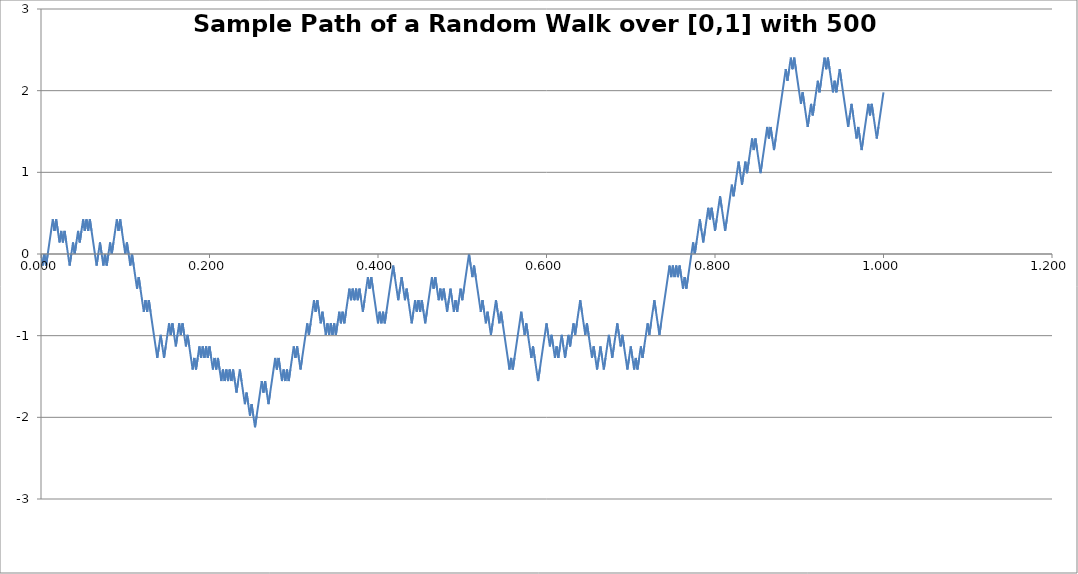
| Category | W_i |
|---|---|
| 0.0 | 0 |
| 0.002 | -0.141 |
| 0.004 | 0 |
| 0.006 | -0.141 |
| 0.008 | 0 |
| 0.01 | 0.141 |
| 0.012 | 0.283 |
| 0.014 | 0.424 |
| 0.016 | 0.283 |
| 0.018000000000000002 | 0.424 |
| 0.020000000000000004 | 0.283 |
| 0.022000000000000006 | 0.141 |
| 0.024000000000000007 | 0.283 |
| 0.02600000000000001 | 0.141 |
| 0.02800000000000001 | 0.283 |
| 0.030000000000000013 | 0.141 |
| 0.032000000000000015 | 0 |
| 0.034000000000000016 | -0.141 |
| 0.03600000000000002 | 0 |
| 0.03800000000000002 | 0.141 |
| 0.04000000000000002 | 0 |
| 0.04200000000000002 | 0.141 |
| 0.044000000000000025 | 0.283 |
| 0.04600000000000003 | 0.141 |
| 0.04800000000000003 | 0.283 |
| 0.05000000000000003 | 0.424 |
| 0.05200000000000003 | 0.283 |
| 0.054000000000000034 | 0.424 |
| 0.056000000000000036 | 0.283 |
| 0.05800000000000004 | 0.424 |
| 0.06000000000000004 | 0.283 |
| 0.06200000000000004 | 0.141 |
| 0.06400000000000004 | 0 |
| 0.06600000000000004 | -0.141 |
| 0.06800000000000005 | 0 |
| 0.07000000000000005 | 0.141 |
| 0.07200000000000005 | 0 |
| 0.07400000000000005 | -0.141 |
| 0.07600000000000005 | 0 |
| 0.07800000000000006 | -0.141 |
| 0.08000000000000006 | 0 |
| 0.08200000000000006 | 0.141 |
| 0.08400000000000006 | 0 |
| 0.08600000000000006 | 0.141 |
| 0.08800000000000006 | 0.283 |
| 0.09000000000000007 | 0.424 |
| 0.09200000000000007 | 0.283 |
| 0.09400000000000007 | 0.424 |
| 0.09600000000000007 | 0.283 |
| 0.09800000000000007 | 0.141 |
| 0.10000000000000007 | 0 |
| 0.10200000000000008 | 0.141 |
| 0.10400000000000008 | 0 |
| 0.10600000000000008 | -0.141 |
| 0.10800000000000008 | 0 |
| 0.11000000000000008 | -0.141 |
| 0.11200000000000009 | -0.283 |
| 0.11400000000000009 | -0.424 |
| 0.11600000000000009 | -0.283 |
| 0.11800000000000009 | -0.424 |
| 0.12000000000000009 | -0.566 |
| 0.1220000000000001 | -0.707 |
| 0.1240000000000001 | -0.566 |
| 0.12600000000000008 | -0.707 |
| 0.12800000000000009 | -0.566 |
| 0.1300000000000001 | -0.707 |
| 0.1320000000000001 | -0.849 |
| 0.1340000000000001 | -0.99 |
| 0.1360000000000001 | -1.131 |
| 0.1380000000000001 | -1.273 |
| 0.1400000000000001 | -1.131 |
| 0.1420000000000001 | -0.99 |
| 0.1440000000000001 | -1.131 |
| 0.1460000000000001 | -1.273 |
| 0.1480000000000001 | -1.131 |
| 0.1500000000000001 | -0.99 |
| 0.1520000000000001 | -0.849 |
| 0.1540000000000001 | -0.99 |
| 0.1560000000000001 | -0.849 |
| 0.1580000000000001 | -0.99 |
| 0.16000000000000011 | -1.131 |
| 0.16200000000000012 | -0.99 |
| 0.16400000000000012 | -0.849 |
| 0.16600000000000012 | -0.99 |
| 0.16800000000000012 | -0.849 |
| 0.17000000000000012 | -0.99 |
| 0.17200000000000013 | -1.131 |
| 0.17400000000000013 | -0.99 |
| 0.17600000000000013 | -1.131 |
| 0.17800000000000013 | -1.273 |
| 0.18000000000000013 | -1.414 |
| 0.18200000000000013 | -1.273 |
| 0.18400000000000014 | -1.414 |
| 0.18600000000000014 | -1.273 |
| 0.18800000000000014 | -1.131 |
| 0.19000000000000014 | -1.273 |
| 0.19200000000000014 | -1.131 |
| 0.19400000000000014 | -1.273 |
| 0.19600000000000015 | -1.131 |
| 0.19800000000000015 | -1.273 |
| 0.20000000000000015 | -1.131 |
| 0.20200000000000015 | -1.273 |
| 0.20400000000000015 | -1.414 |
| 0.20600000000000016 | -1.273 |
| 0.20800000000000016 | -1.414 |
| 0.21000000000000016 | -1.273 |
| 0.21200000000000016 | -1.414 |
| 0.21400000000000016 | -1.556 |
| 0.21600000000000016 | -1.414 |
| 0.21800000000000017 | -1.556 |
| 0.22000000000000017 | -1.414 |
| 0.22200000000000017 | -1.556 |
| 0.22400000000000017 | -1.414 |
| 0.22600000000000017 | -1.556 |
| 0.22800000000000017 | -1.414 |
| 0.23000000000000018 | -1.556 |
| 0.23200000000000018 | -1.697 |
| 0.23400000000000018 | -1.556 |
| 0.23600000000000018 | -1.414 |
| 0.23800000000000018 | -1.556 |
| 0.24000000000000019 | -1.697 |
| 0.2420000000000002 | -1.838 |
| 0.2440000000000002 | -1.697 |
| 0.2460000000000002 | -1.838 |
| 0.2480000000000002 | -1.98 |
| 0.25000000000000017 | -1.838 |
| 0.25200000000000017 | -1.98 |
| 0.25400000000000017 | -2.121 |
| 0.25600000000000017 | -1.98 |
| 0.2580000000000002 | -1.838 |
| 0.2600000000000002 | -1.697 |
| 0.2620000000000002 | -1.556 |
| 0.2640000000000002 | -1.697 |
| 0.2660000000000002 | -1.556 |
| 0.2680000000000002 | -1.697 |
| 0.2700000000000002 | -1.838 |
| 0.2720000000000002 | -1.697 |
| 0.2740000000000002 | -1.556 |
| 0.2760000000000002 | -1.414 |
| 0.2780000000000002 | -1.273 |
| 0.2800000000000002 | -1.414 |
| 0.2820000000000002 | -1.273 |
| 0.2840000000000002 | -1.414 |
| 0.2860000000000002 | -1.556 |
| 0.2880000000000002 | -1.414 |
| 0.2900000000000002 | -1.556 |
| 0.2920000000000002 | -1.414 |
| 0.2940000000000002 | -1.556 |
| 0.2960000000000002 | -1.414 |
| 0.2980000000000002 | -1.273 |
| 0.3000000000000002 | -1.131 |
| 0.3020000000000002 | -1.273 |
| 0.3040000000000002 | -1.131 |
| 0.3060000000000002 | -1.273 |
| 0.3080000000000002 | -1.414 |
| 0.3100000000000002 | -1.273 |
| 0.3120000000000002 | -1.131 |
| 0.3140000000000002 | -0.99 |
| 0.3160000000000002 | -0.849 |
| 0.3180000000000002 | -0.99 |
| 0.32000000000000023 | -0.849 |
| 0.32200000000000023 | -0.707 |
| 0.32400000000000023 | -0.566 |
| 0.32600000000000023 | -0.707 |
| 0.32800000000000024 | -0.566 |
| 0.33000000000000024 | -0.707 |
| 0.33200000000000024 | -0.849 |
| 0.33400000000000024 | -0.707 |
| 0.33600000000000024 | -0.849 |
| 0.33800000000000024 | -0.99 |
| 0.34000000000000025 | -0.849 |
| 0.34200000000000025 | -0.99 |
| 0.34400000000000025 | -0.849 |
| 0.34600000000000025 | -0.99 |
| 0.34800000000000025 | -0.849 |
| 0.35000000000000026 | -0.99 |
| 0.35200000000000026 | -0.849 |
| 0.35400000000000026 | -0.707 |
| 0.35600000000000026 | -0.849 |
| 0.35800000000000026 | -0.707 |
| 0.36000000000000026 | -0.849 |
| 0.36200000000000027 | -0.707 |
| 0.36400000000000027 | -0.566 |
| 0.36600000000000027 | -0.424 |
| 0.36800000000000027 | -0.566 |
| 0.3700000000000003 | -0.424 |
| 0.3720000000000003 | -0.566 |
| 0.3740000000000003 | -0.424 |
| 0.3760000000000003 | -0.566 |
| 0.3780000000000003 | -0.424 |
| 0.3800000000000003 | -0.566 |
| 0.3820000000000003 | -0.707 |
| 0.3840000000000003 | -0.566 |
| 0.3860000000000003 | -0.424 |
| 0.3880000000000003 | -0.283 |
| 0.3900000000000003 | -0.424 |
| 0.3920000000000003 | -0.283 |
| 0.3940000000000003 | -0.424 |
| 0.3960000000000003 | -0.566 |
| 0.3980000000000003 | -0.707 |
| 0.4000000000000003 | -0.849 |
| 0.4020000000000003 | -0.707 |
| 0.4040000000000003 | -0.849 |
| 0.4060000000000003 | -0.707 |
| 0.4080000000000003 | -0.849 |
| 0.4100000000000003 | -0.707 |
| 0.4120000000000003 | -0.566 |
| 0.4140000000000003 | -0.424 |
| 0.4160000000000003 | -0.283 |
| 0.4180000000000003 | -0.141 |
| 0.4200000000000003 | -0.283 |
| 0.4220000000000003 | -0.424 |
| 0.4240000000000003 | -0.566 |
| 0.4260000000000003 | -0.424 |
| 0.4280000000000003 | -0.283 |
| 0.4300000000000003 | -0.424 |
| 0.43200000000000033 | -0.566 |
| 0.43400000000000033 | -0.424 |
| 0.43600000000000033 | -0.566 |
| 0.43800000000000033 | -0.707 |
| 0.44000000000000034 | -0.849 |
| 0.44200000000000034 | -0.707 |
| 0.44400000000000034 | -0.566 |
| 0.44600000000000034 | -0.707 |
| 0.44800000000000034 | -0.566 |
| 0.45000000000000034 | -0.707 |
| 0.45200000000000035 | -0.566 |
| 0.45400000000000035 | -0.707 |
| 0.45600000000000035 | -0.849 |
| 0.45800000000000035 | -0.707 |
| 0.46000000000000035 | -0.566 |
| 0.46200000000000035 | -0.424 |
| 0.46400000000000036 | -0.283 |
| 0.46600000000000036 | -0.424 |
| 0.46800000000000036 | -0.283 |
| 0.47000000000000036 | -0.424 |
| 0.47200000000000036 | -0.566 |
| 0.47400000000000037 | -0.424 |
| 0.47600000000000037 | -0.566 |
| 0.47800000000000037 | -0.424 |
| 0.48000000000000037 | -0.566 |
| 0.4820000000000004 | -0.707 |
| 0.4840000000000004 | -0.566 |
| 0.4860000000000004 | -0.424 |
| 0.4880000000000004 | -0.566 |
| 0.4900000000000004 | -0.707 |
| 0.4920000000000004 | -0.566 |
| 0.4940000000000004 | -0.707 |
| 0.4960000000000004 | -0.566 |
| 0.4980000000000004 | -0.424 |
| 0.5000000000000003 | -0.566 |
| 0.5020000000000003 | -0.424 |
| 0.5040000000000003 | -0.283 |
| 0.5060000000000003 | -0.141 |
| 0.5080000000000003 | 0 |
| 0.5100000000000003 | -0.141 |
| 0.5120000000000003 | -0.283 |
| 0.5140000000000003 | -0.141 |
| 0.5160000000000003 | -0.283 |
| 0.5180000000000003 | -0.424 |
| 0.5200000000000004 | -0.566 |
| 0.5220000000000004 | -0.707 |
| 0.5240000000000004 | -0.566 |
| 0.5260000000000004 | -0.707 |
| 0.5280000000000004 | -0.849 |
| 0.5300000000000004 | -0.707 |
| 0.5320000000000004 | -0.849 |
| 0.5340000000000004 | -0.99 |
| 0.5360000000000004 | -0.849 |
| 0.5380000000000004 | -0.707 |
| 0.5400000000000004 | -0.566 |
| 0.5420000000000004 | -0.707 |
| 0.5440000000000004 | -0.849 |
| 0.5460000000000004 | -0.707 |
| 0.5480000000000004 | -0.849 |
| 0.5500000000000004 | -0.99 |
| 0.5520000000000004 | -1.131 |
| 0.5540000000000004 | -1.273 |
| 0.5560000000000004 | -1.414 |
| 0.5580000000000004 | -1.273 |
| 0.5600000000000004 | -1.414 |
| 0.5620000000000004 | -1.273 |
| 0.5640000000000004 | -1.131 |
| 0.5660000000000004 | -0.99 |
| 0.5680000000000004 | -0.849 |
| 0.5700000000000004 | -0.707 |
| 0.5720000000000004 | -0.849 |
| 0.5740000000000004 | -0.99 |
| 0.5760000000000004 | -0.849 |
| 0.5780000000000004 | -0.99 |
| 0.5800000000000004 | -1.131 |
| 0.5820000000000004 | -1.273 |
| 0.5840000000000004 | -1.131 |
| 0.5860000000000004 | -1.273 |
| 0.5880000000000004 | -1.414 |
| 0.5900000000000004 | -1.556 |
| 0.5920000000000004 | -1.414 |
| 0.5940000000000004 | -1.273 |
| 0.5960000000000004 | -1.131 |
| 0.5980000000000004 | -0.99 |
| 0.6000000000000004 | -0.849 |
| 0.6020000000000004 | -0.99 |
| 0.6040000000000004 | -1.131 |
| 0.6060000000000004 | -0.99 |
| 0.6080000000000004 | -1.131 |
| 0.6100000000000004 | -1.273 |
| 0.6120000000000004 | -1.131 |
| 0.6140000000000004 | -1.273 |
| 0.6160000000000004 | -1.131 |
| 0.6180000000000004 | -0.99 |
| 0.6200000000000004 | -1.131 |
| 0.6220000000000004 | -1.273 |
| 0.6240000000000004 | -1.131 |
| 0.6260000000000004 | -0.99 |
| 0.6280000000000004 | -1.131 |
| 0.6300000000000004 | -0.99 |
| 0.6320000000000005 | -0.849 |
| 0.6340000000000005 | -0.99 |
| 0.6360000000000005 | -0.849 |
| 0.6380000000000005 | -0.707 |
| 0.6400000000000005 | -0.566 |
| 0.6420000000000005 | -0.707 |
| 0.6440000000000005 | -0.849 |
| 0.6460000000000005 | -0.99 |
| 0.6480000000000005 | -0.849 |
| 0.6500000000000005 | -0.99 |
| 0.6520000000000005 | -1.131 |
| 0.6540000000000005 | -1.273 |
| 0.6560000000000005 | -1.131 |
| 0.6580000000000005 | -1.273 |
| 0.6600000000000005 | -1.414 |
| 0.6620000000000005 | -1.273 |
| 0.6640000000000005 | -1.131 |
| 0.6660000000000005 | -1.273 |
| 0.6680000000000005 | -1.414 |
| 0.6700000000000005 | -1.273 |
| 0.6720000000000005 | -1.131 |
| 0.6740000000000005 | -0.99 |
| 0.6760000000000005 | -1.131 |
| 0.6780000000000005 | -1.273 |
| 0.6800000000000005 | -1.131 |
| 0.6820000000000005 | -0.99 |
| 0.6840000000000005 | -0.849 |
| 0.6860000000000005 | -0.99 |
| 0.6880000000000005 | -1.131 |
| 0.6900000000000005 | -0.99 |
| 0.6920000000000005 | -1.131 |
| 0.6940000000000005 | -1.273 |
| 0.6960000000000005 | -1.414 |
| 0.6980000000000005 | -1.273 |
| 0.7000000000000005 | -1.131 |
| 0.7020000000000005 | -1.273 |
| 0.7040000000000005 | -1.414 |
| 0.7060000000000005 | -1.273 |
| 0.7080000000000005 | -1.414 |
| 0.7100000000000005 | -1.273 |
| 0.7120000000000005 | -1.131 |
| 0.7140000000000005 | -1.273 |
| 0.7160000000000005 | -1.131 |
| 0.7180000000000005 | -0.99 |
| 0.7200000000000005 | -0.849 |
| 0.7220000000000005 | -0.99 |
| 0.7240000000000005 | -0.849 |
| 0.7260000000000005 | -0.707 |
| 0.7280000000000005 | -0.566 |
| 0.7300000000000005 | -0.707 |
| 0.7320000000000005 | -0.849 |
| 0.7340000000000005 | -0.99 |
| 0.7360000000000005 | -0.849 |
| 0.7380000000000005 | -0.707 |
| 0.7400000000000005 | -0.566 |
| 0.7420000000000005 | -0.424 |
| 0.7440000000000005 | -0.283 |
| 0.7460000000000006 | -0.141 |
| 0.7480000000000006 | -0.283 |
| 0.7500000000000006 | -0.141 |
| 0.7520000000000006 | -0.283 |
| 0.7540000000000006 | -0.141 |
| 0.7560000000000006 | -0.283 |
| 0.7580000000000006 | -0.141 |
| 0.7600000000000006 | -0.283 |
| 0.7620000000000006 | -0.424 |
| 0.7640000000000006 | -0.283 |
| 0.7660000000000006 | -0.424 |
| 0.7680000000000006 | -0.283 |
| 0.7700000000000006 | -0.141 |
| 0.7720000000000006 | 0 |
| 0.7740000000000006 | 0.141 |
| 0.7760000000000006 | 0 |
| 0.7780000000000006 | 0.141 |
| 0.7800000000000006 | 0.283 |
| 0.7820000000000006 | 0.424 |
| 0.7840000000000006 | 0.283 |
| 0.7860000000000006 | 0.141 |
| 0.7880000000000006 | 0.283 |
| 0.7900000000000006 | 0.424 |
| 0.7920000000000006 | 0.566 |
| 0.7940000000000006 | 0.424 |
| 0.7960000000000006 | 0.566 |
| 0.7980000000000006 | 0.424 |
| 0.8000000000000006 | 0.283 |
| 0.8020000000000006 | 0.424 |
| 0.8040000000000006 | 0.566 |
| 0.8060000000000006 | 0.707 |
| 0.8080000000000006 | 0.566 |
| 0.8100000000000006 | 0.424 |
| 0.8120000000000006 | 0.283 |
| 0.8140000000000006 | 0.424 |
| 0.8160000000000006 | 0.566 |
| 0.8180000000000006 | 0.707 |
| 0.8200000000000006 | 0.849 |
| 0.8220000000000006 | 0.707 |
| 0.8240000000000006 | 0.849 |
| 0.8260000000000006 | 0.99 |
| 0.8280000000000006 | 1.131 |
| 0.8300000000000006 | 0.99 |
| 0.8320000000000006 | 0.849 |
| 0.8340000000000006 | 0.99 |
| 0.8360000000000006 | 1.131 |
| 0.8380000000000006 | 0.99 |
| 0.8400000000000006 | 1.131 |
| 0.8420000000000006 | 1.273 |
| 0.8440000000000006 | 1.414 |
| 0.8460000000000006 | 1.273 |
| 0.8480000000000006 | 1.414 |
| 0.8500000000000006 | 1.273 |
| 0.8520000000000006 | 1.131 |
| 0.8540000000000006 | 0.99 |
| 0.8560000000000006 | 1.131 |
| 0.8580000000000007 | 1.273 |
| 0.8600000000000007 | 1.414 |
| 0.8620000000000007 | 1.556 |
| 0.8640000000000007 | 1.414 |
| 0.8660000000000007 | 1.556 |
| 0.8680000000000007 | 1.414 |
| 0.8700000000000007 | 1.273 |
| 0.8720000000000007 | 1.414 |
| 0.8740000000000007 | 1.556 |
| 0.8760000000000007 | 1.697 |
| 0.8780000000000007 | 1.838 |
| 0.8800000000000007 | 1.98 |
| 0.8820000000000007 | 2.121 |
| 0.8840000000000007 | 2.263 |
| 0.8860000000000007 | 2.121 |
| 0.8880000000000007 | 2.263 |
| 0.8900000000000007 | 2.404 |
| 0.8920000000000007 | 2.263 |
| 0.8940000000000007 | 2.404 |
| 0.8960000000000007 | 2.263 |
| 0.8980000000000007 | 2.121 |
| 0.9000000000000007 | 1.98 |
| 0.9020000000000007 | 1.838 |
| 0.9040000000000007 | 1.98 |
| 0.9060000000000007 | 1.838 |
| 0.9080000000000007 | 1.697 |
| 0.9100000000000007 | 1.556 |
| 0.9120000000000007 | 1.697 |
| 0.9140000000000007 | 1.838 |
| 0.9160000000000007 | 1.697 |
| 0.9180000000000007 | 1.838 |
| 0.9200000000000007 | 1.98 |
| 0.9220000000000007 | 2.121 |
| 0.9240000000000007 | 1.98 |
| 0.9260000000000007 | 2.121 |
| 0.9280000000000007 | 2.263 |
| 0.9300000000000007 | 2.404 |
| 0.9320000000000007 | 2.263 |
| 0.9340000000000007 | 2.404 |
| 0.9360000000000007 | 2.263 |
| 0.9380000000000007 | 2.121 |
| 0.9400000000000007 | 1.98 |
| 0.9420000000000007 | 2.121 |
| 0.9440000000000007 | 1.98 |
| 0.9460000000000007 | 2.121 |
| 0.9480000000000007 | 2.263 |
| 0.9500000000000007 | 2.121 |
| 0.9520000000000007 | 1.98 |
| 0.9540000000000007 | 1.838 |
| 0.9560000000000007 | 1.697 |
| 0.9580000000000007 | 1.556 |
| 0.9600000000000007 | 1.697 |
| 0.9620000000000007 | 1.838 |
| 0.9640000000000007 | 1.697 |
| 0.9660000000000007 | 1.556 |
| 0.9680000000000007 | 1.414 |
| 0.9700000000000008 | 1.556 |
| 0.9720000000000008 | 1.414 |
| 0.9740000000000008 | 1.273 |
| 0.9760000000000008 | 1.414 |
| 0.9780000000000008 | 1.556 |
| 0.9800000000000008 | 1.697 |
| 0.9820000000000008 | 1.838 |
| 0.9840000000000008 | 1.697 |
| 0.9860000000000008 | 1.838 |
| 0.9880000000000008 | 1.697 |
| 0.9900000000000008 | 1.556 |
| 0.9920000000000008 | 1.414 |
| 0.9940000000000008 | 1.556 |
| 0.9960000000000008 | 1.697 |
| 0.9980000000000008 | 1.838 |
| 1.0000000000000007 | 1.98 |